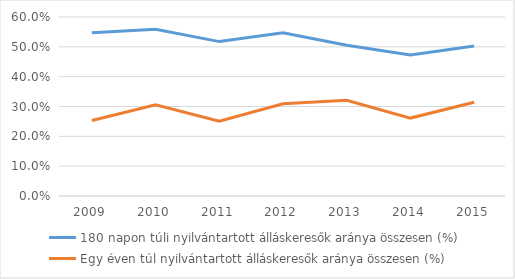
| Category | 180 napon túli nyilvántartott álláskeresők aránya összesen (%) | Egy éven túl nyilvántartott álláskeresők aránya összesen (%) |
|---|---|---|
| 2009.0 | 0.547 | 0.253 |
| 2010.0 | 0.559 | 0.306 |
| 2011.0 | 0.518 | 0.251 |
| 2012.0 | 0.547 | 0.309 |
| 2013.0 | 0.506 | 0.321 |
| 2014.0 | 0.472 | 0.261 |
| 2015.0 | 0.503 | 0.314 |